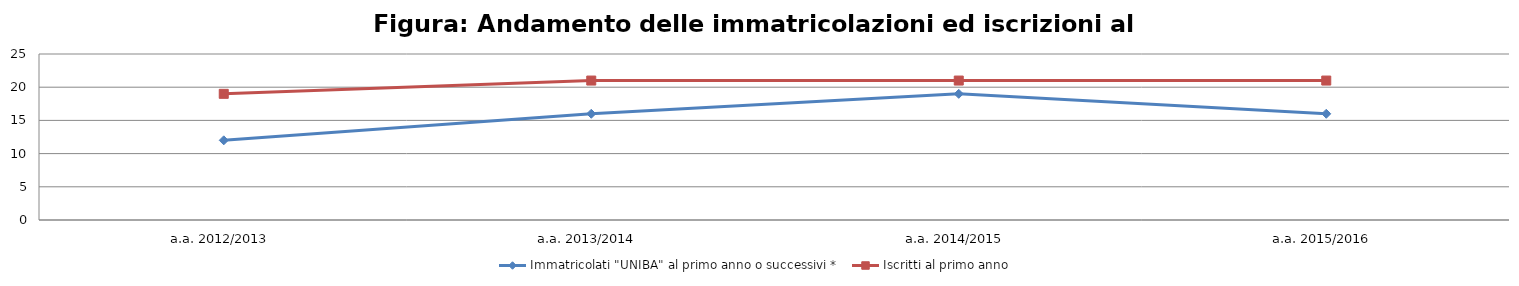
| Category | Immatricolati "UNIBA" al primo anno o successivi * | Iscritti al primo anno  |
|---|---|---|
| a.a. 2012/2013 | 12 | 19 |
| a.a. 2013/2014 | 16 | 21 |
| a.a. 2014/2015 | 19 | 21 |
| a.a. 2015/2016 | 16 | 21 |